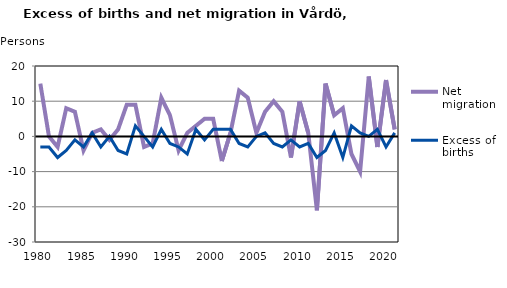
| Category | Net migration | Excess of births |
|---|---|---|
| 1980.0 | 15 | -3 |
| 1981.0 | 0 | -3 |
| 1982.0 | -3 | -6 |
| 1983.0 | 8 | -4 |
| 1984.0 | 7 | -1 |
| 1985.0 | -4 | -3 |
| 1986.0 | 1 | 1 |
| 1987.0 | 2 | -3 |
| 1988.0 | -1 | 0 |
| 1989.0 | 2 | -4 |
| 1990.0 | 9 | -5 |
| 1991.0 | 9 | 3 |
| 1992.0 | -3 | 0 |
| 1993.0 | -2 | -3 |
| 1994.0 | 11 | 2 |
| 1995.0 | 6 | -2 |
| 1996.0 | -4 | -3 |
| 1997.0 | 1 | -5 |
| 1998.0 | 3 | 2 |
| 1999.0 | 5 | -1 |
| 2000.0 | 5 | 2 |
| 2001.0 | -7 | 2 |
| 2002.0 | 1 | 2 |
| 2003.0 | 13 | -2 |
| 2004.0 | 11 | -3 |
| 2005.0 | 1 | 0 |
| 2006.0 | 7 | 1 |
| 2007.0 | 10 | -2 |
| 2008.0 | 7 | -3 |
| 2009.0 | -6 | -1 |
| 2010.0 | 10 | -3 |
| 2011.0 | 1 | -2 |
| 2012.0 | -21 | -6 |
| 2013.0 | 15 | -4 |
| 2014.0 | 6 | 1 |
| 2015.0 | 8 | -6 |
| 2016.0 | -5 | 3 |
| 2017.0 | -10 | 1 |
| 2018.0 | 17 | 0 |
| 2019.0 | -3 | 2 |
| 2020.0 | 16 | -3 |
| 2021.0 | 2 | 1 |